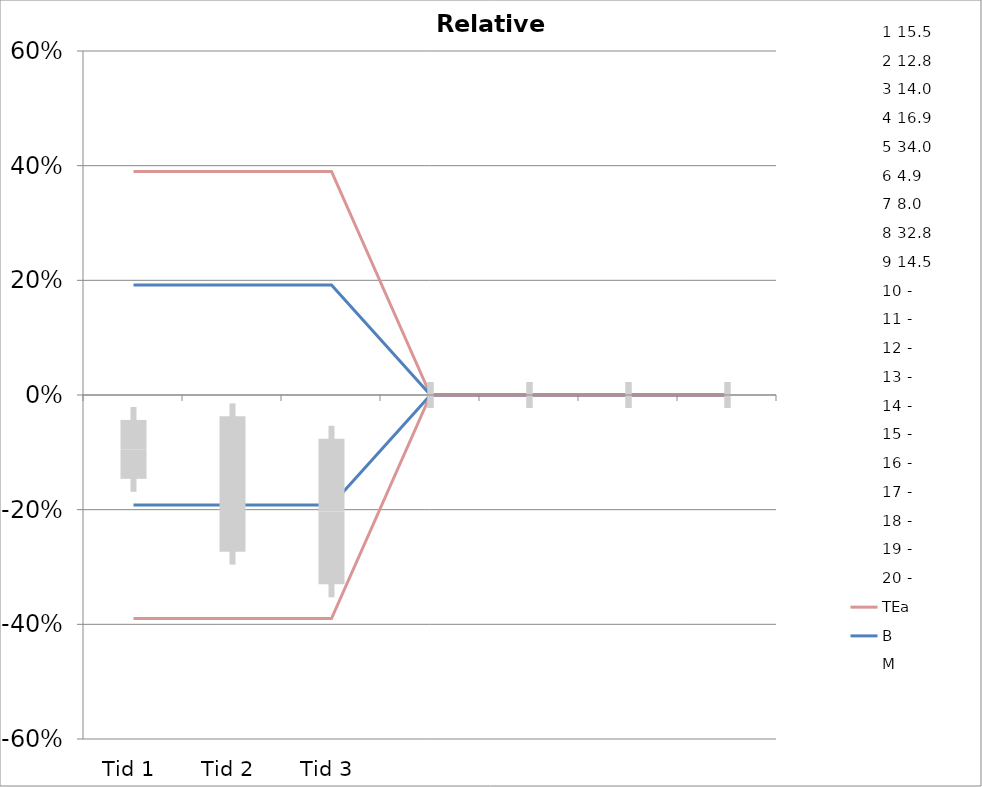
| Category | 1 | 2 | 3 | 4 | 5 | 6 | 7 | 8 | 9 | 10 | 11 | 12 | 13 | 14 | 15 | 16 | 17 | 18 | 19 | 20 | TEa | B | -B | -TEa | M |
|---|---|---|---|---|---|---|---|---|---|---|---|---|---|---|---|---|---|---|---|---|---|---|---|---|---|
| Tid 1 | -0.084 | -0.188 | -0.093 | -0.178 | -0.012 | -0.163 | -0.075 | -0.027 | -0.034 | 0 | 0 | 0 | 0 | 0 | 0 | 0 | 0 | 0 | 0 | 0 | 0.39 | 0.192 | -0.192 | -0.39 | -0.095 |
| Tid 2 | -0.058 | -0.453 | -0.114 | -0.325 | -0.026 | -0.224 | 0 | -0.037 | -0.159 | 0 | 0 | 0 | 0 | 0 | 0 | 0 | 0 | 0 | 0 | 0 | 0.39 | 0.192 | -0.192 | -0.39 | -0.155 |
| Tid 3 | -0.161 | -0.484 | -0.186 | -0.396 | -0.068 | -0.347 | -0.05 | -0.088 | -0.048 | 0 | 0 | 0 | 0 | 0 | 0 | 0 | 0 | 0 | 0 | 0 | 0.39 | 0.192 | -0.192 | -0.39 | -0.203 |